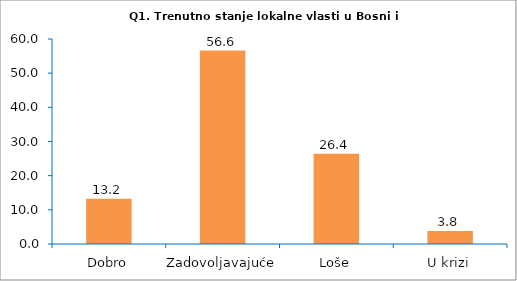
| Category | Series 0 |
|---|---|
| Dobro | 13.208 |
| Zadovoljavajuće | 56.604 |
| Loše | 26.415 |
| U krizi | 3.774 |